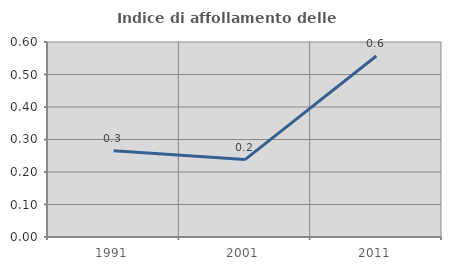
| Category | Indice di affollamento delle abitazioni  |
|---|---|
| 1991.0 | 0.265 |
| 2001.0 | 0.238 |
| 2011.0 | 0.557 |